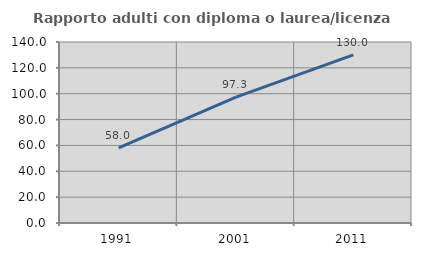
| Category | Rapporto adulti con diploma o laurea/licenza media  |
|---|---|
| 1991.0 | 58.031 |
| 2001.0 | 97.333 |
| 2011.0 | 130 |